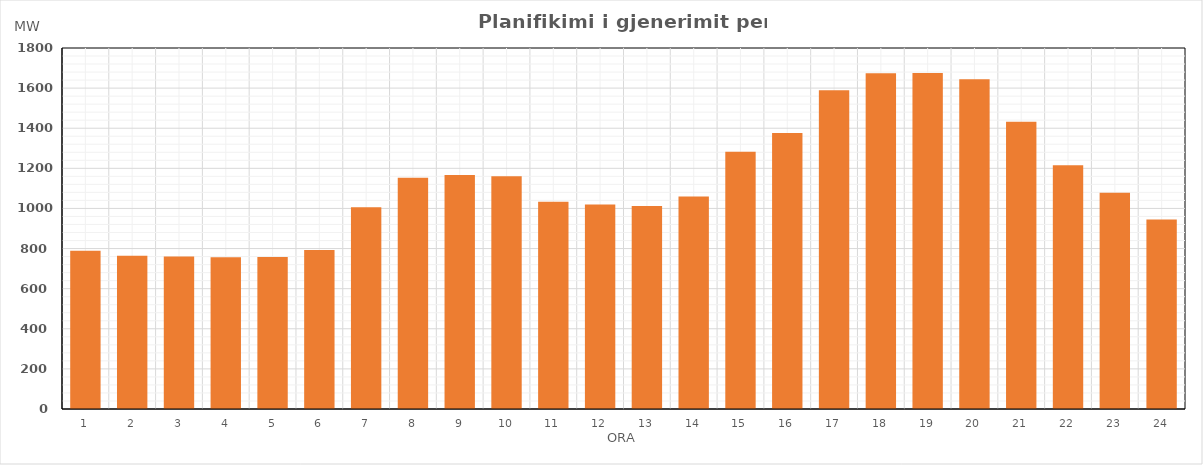
| Category | Max (MW) |
|---|---|
| 0 | 789.37 |
| 1 | 764.54 |
| 2 | 760.24 |
| 3 | 756.74 |
| 4 | 758.33 |
| 5 | 792.81 |
| 6 | 1006.31 |
| 7 | 1153.42 |
| 8 | 1166.17 |
| 9 | 1160.56 |
| 10 | 1034 |
| 11 | 1019.35 |
| 12 | 1012.43 |
| 13 | 1058.97 |
| 14 | 1282.07 |
| 15 | 1376.46 |
| 16 | 1589.71 |
| 17 | 1674.61 |
| 18 | 1675.79 |
| 19 | 1644.09 |
| 20 | 1431.81 |
| 21 | 1214.85 |
| 22 | 1078.08 |
| 23 | 945.48 |